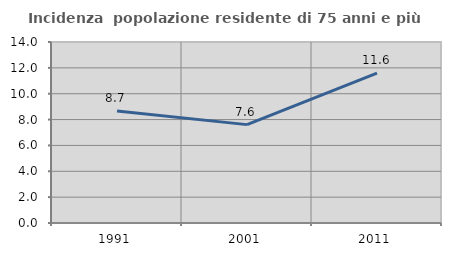
| Category | Incidenza  popolazione residente di 75 anni e più |
|---|---|
| 1991.0 | 8.671 |
| 2001.0 | 7.61 |
| 2011.0 | 11.595 |